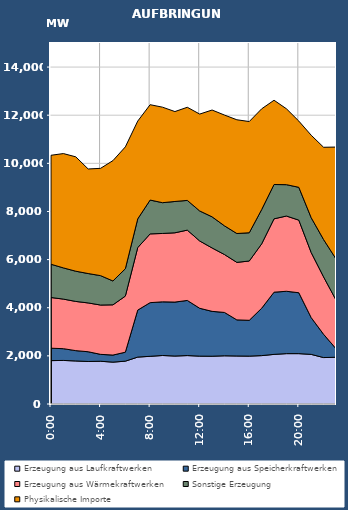
| Category | Erzeugung aus Laufkraftwerken | Erzeugung aus Speicherkraftwerken | Erzeugung aus Wärmekraftwerken | Sonstige Erzeugung | Physikalische Importe |
|---|---|---|---|---|---|
| 2007-01-17 | 1802.428 | 516.516 | 2105.817 | 1382.394 | 4527.766 |
| 2007-01-17 01:00:00 | 1810.323 | 488.193 | 2060.457 | 1296.005 | 4750.514 |
| 2007-01-17 02:00:00 | 1788.199 | 428.979 | 2044.437 | 1256.208 | 4751.85 |
| 2007-01-17 03:00:00 | 1766.116 | 404.972 | 2028.31 | 1221.393 | 4344.47 |
| 2007-01-17 04:00:00 | 1775.933 | 287.12 | 2048.734 | 1222.289 | 4457.77 |
| 2007-01-17 05:00:00 | 1739.952 | 293.001 | 2087.968 | 991.035 | 5001.562 |
| 2007-01-17 06:00:00 | 1780.145 | 372.161 | 2331.655 | 1135.283 | 5064.894 |
| 2007-01-17 07:00:00 | 1949.594 | 1953.016 | 2595.647 | 1194.045 | 4063.51 |
| 2007-01-17 08:00:00 | 1981.806 | 2229.233 | 2857.574 | 1405.835 | 3961.834 |
| 2007-01-17 09:00:00 | 2015.657 | 2229.695 | 2840.693 | 1279.385 | 3968.074 |
| 2007-01-17 10:00:00 | 1992.647 | 2242.238 | 2879.191 | 1301.175 | 3735.354 |
| 2007-01-17 11:00:00 | 2012.388 | 2290.884 | 2921.867 | 1234.889 | 3869.074 |
| 2007-01-17 12:00:00 | 1988.852 | 1988.588 | 2797.328 | 1246.737 | 4025.494 |
| 2007-01-17 13:00:00 | 1985.591 | 1863.822 | 2634.825 | 1292.542 | 4438.466 |
| 2007-01-17 14:00:00 | 2003.333 | 1800.88 | 2406.911 | 1192.356 | 4602.246 |
| 2007-01-17 15:00:00 | 1994.514 | 1500.714 | 2390.071 | 1198.482 | 4725.946 |
| 2007-01-17 16:00:00 | 1989.39 | 1488.567 | 2463.777 | 1173.471 | 4621.366 |
| 2007-01-17 17:00:00 | 2010.121 | 1966.618 | 2676.498 | 1424.481 | 4186.914 |
| 2007-01-17 18:00:00 | 2061.556 | 2583.891 | 3049.037 | 1425.882 | 3501.182 |
| 2007-01-17 19:00:00 | 2092.994 | 2590.955 | 3126.918 | 1302.914 | 3153.078 |
| 2007-01-17 20:00:00 | 2092.973 | 2530.725 | 3017.146 | 1363.322 | 2750.634 |
| 2007-01-17 21:00:00 | 2061.596 | 1526.784 | 2705.333 | 1446.324 | 3427.318 |
| 2007-01-17 22:00:00 | 1928.969 | 966.172 | 2385.668 | 1551.586 | 3835.03 |
| 2007-01-17 23:00:00 | 1943.592 | 355.172 | 2025.606 | 1707.026 | 4644.762 |